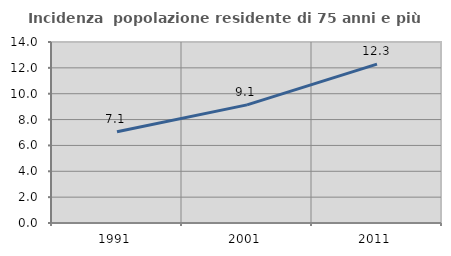
| Category | Incidenza  popolazione residente di 75 anni e più |
|---|---|
| 1991.0 | 7.053 |
| 2001.0 | 9.138 |
| 2011.0 | 12.293 |